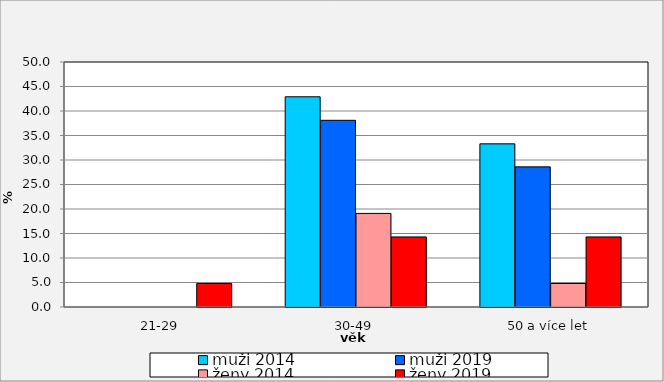
| Category | muži 2014 | muži 2019 | ženy 2014 | ženy 2019 |
|---|---|---|---|---|
| 21-29 | 0 | 0 | 0 | 4.8 |
| 30-49 | 42.9 | 38.1 | 19.1 | 14.3 |
| 50 a více let | 33.3 | 28.6 | 4.8 | 14.3 |